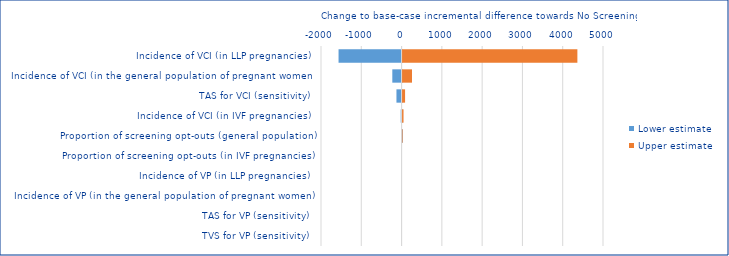
| Category | Lower estimate | Upper estimate |
|---|---|---|
| Incidence of VCI (in LLP pregnancies) | -1564.296 | 4339.274 |
| Incidence of VCI (in the general population of pregnant women) | -229.948 | 234.51 |
| TAS for VCI (sensitivity) | -127.09 | 62.206 |
| Incidence of VCI (in IVF pregnancies) | -21.378 | 23.526 |
| Proportion of screening opt-outs (general population) | 1.173 | -6.64 |
| Proportion of screening opt-outs (in IVF pregnancies) | 0 | 0 |
| Incidence of VP (in LLP pregnancies) | 0 | 0 |
| Incidence of VP (in the general population of pregnant women) | 0 | 0 |
| TAS for VP (sensitivity) | 0 | 0 |
| TVS for VP (sensitivity) | 0 | 0 |